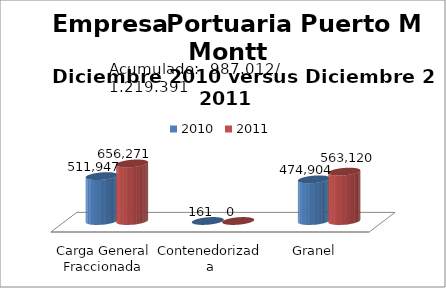
| Category | 2010 | 2011 |
|---|---|---|
| Carga General Fraccionada | 511947 | 656271 |
| Contenedorizada | 161 | 0 |
| Granel | 474904 | 563120 |